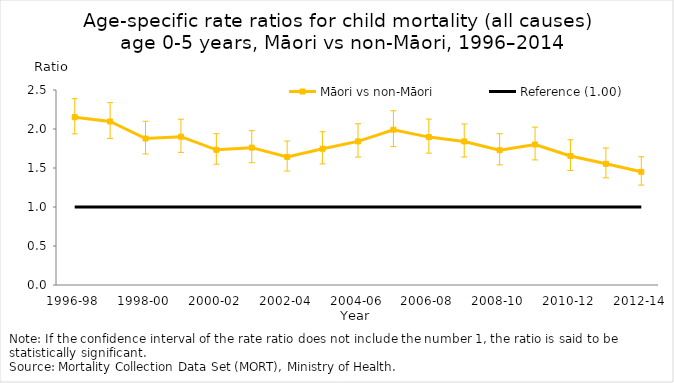
| Category | Māori vs non-Māori | Reference (1.00) |
|---|---|---|
| 1996-98 | 2.151 | 1 |
| 1997-99 | 2.097 | 1 |
| 1998-00 | 1.878 | 1 |
| 1999-01 | 1.901 | 1 |
| 2000-02 | 1.733 | 1 |
| 2001-03 | 1.761 | 1 |
| 2002-04 | 1.642 | 1 |
| 2003-05 | 1.747 | 1 |
| 2004-06 | 1.841 | 1 |
| 2005-07 | 1.991 | 1 |
| 2006-08 | 1.896 | 1 |
| 2007-09 | 1.841 | 1 |
| 2008-10 | 1.728 | 1 |
| 2009-11 | 1.801 | 1 |
| 2010-12 | 1.654 | 1 |
| 2011-13 | 1.554 | 1 |
| 2012-14 | 1.451 | 1 |